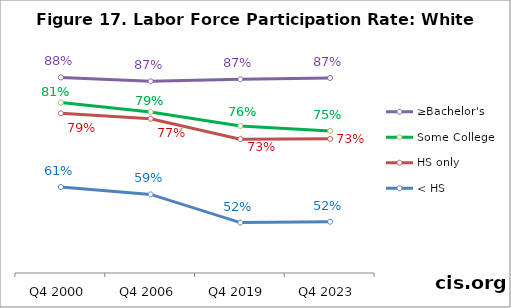
| Category | ≥Bachelor's | Some College | HS only | < HS |
|---|---|---|---|---|
| Q4 2000 | 0.875 | 0.814 | 0.788 | 0.609 |
| Q4 2006 | 0.866 | 0.791 | 0.775 | 0.591 |
| Q4 2019 | 0.871 | 0.757 | 0.725 | 0.522 |
| Q4 2023 | 0.874 | 0.745 | 0.726 | 0.525 |